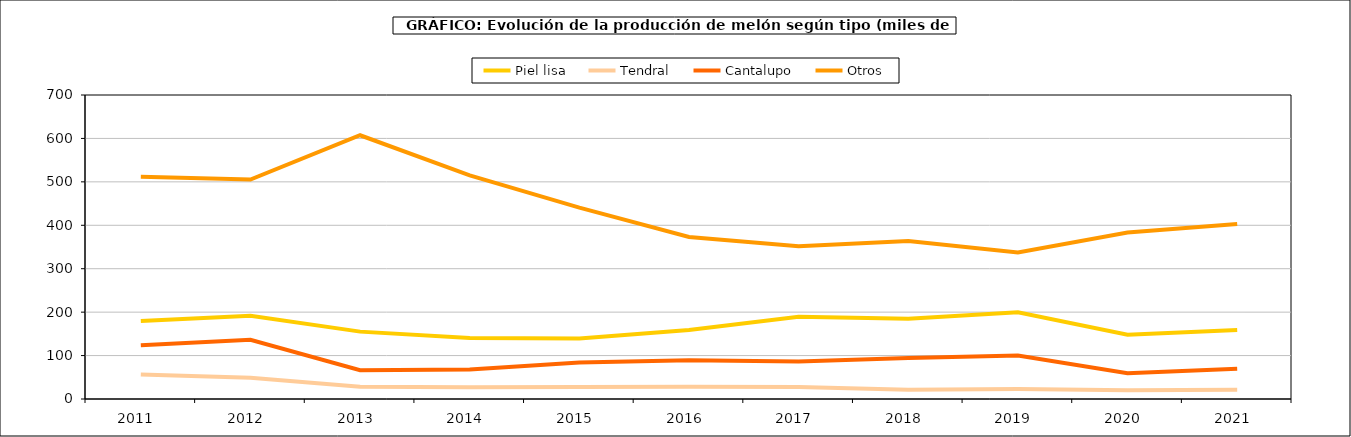
| Category | Piel lisa | Tendral | Cantalupo | Otros |
|---|---|---|---|---|
| 2011.0 | 179.519 | 56.591 | 124.015 | 511.871 |
| 2012.0 | 191.896 | 49.169 | 136.333 | 505.471 |
| 2013.0 | 155.121 | 28.073 | 66.453 | 607.304 |
| 2014.0 | 140.682 | 27.23 | 67.816 | 514.864 |
| 2015.0 | 139.486 | 27.748 | 84.305 | 440.517 |
| 2016.0 | 158.886 | 28.45 | 89.425 | 373.006 |
| 2017.0 | 189.59 | 27.88 | 86.499 | 351.708 |
| 2018.0 | 184.675 | 21.163 | 94.594 | 363.921 |
| 2019.0 | 199.826 | 22.833 | 100.181 | 337.351 |
| 2020.0 | 147.925 | 20.256 | 59.257 | 383.54 |
| 2021.0 | 158.644 | 21.431 | 69.797 | 402.731 |